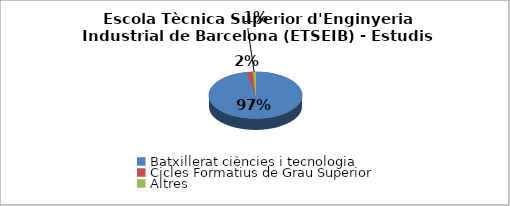
| Category | Escola Tècnica Superior d'Enginyeria Industrial de Barcelona (ETSEIB) - Estudis cursats |
|---|---|
| Batxillerat ciències i tecnologia | 0.97 |
| Cicles Formatius de Grau Superior | 0.021 |
| Altres | 0.009 |